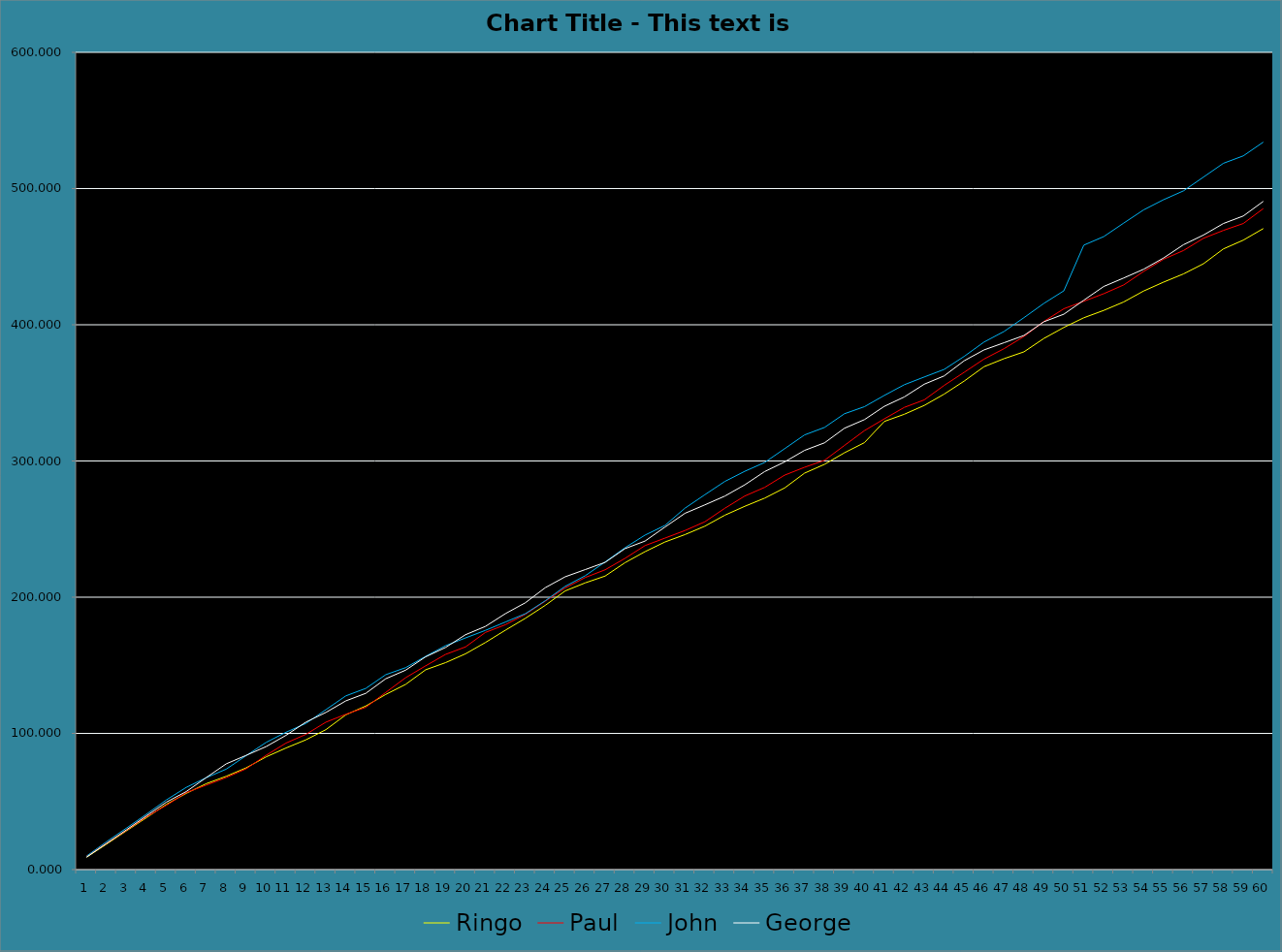
| Category | Ringo | Paul | John | George |
|---|---|---|---|---|
| 0 | 9.112 | 9.902 | 9.903 | 9.095 |
| 1 | 18.694 | 19.224 | 20.458 | 19.196 |
| 2 | 28.428 | 28.824 | 30.459 | 29.201 |
| 3 | 38.083 | 38.768 | 40.66 | 39.439 |
| 4 | 47.923 | 47.185 | 51.139 | 49.519 |
| 5 | 55.989 | 56.522 | 60.38 | 57.294 |
| 6 | 63.088 | 62.011 | 67.46 | 67.557 |
| 7 | 68.505 | 67.576 | 73.738 | 77.635 |
| 8 | 74.698 | 74.008 | 83.643 | 83.864 |
| 9 | 82.735 | 83.901 | 93.362 | 90.295 |
| 10 | 89.275 | 92.894 | 100.828 | 98.567 |
| 11 | 95.293 | 99.287 | 107.333 | 108.324 |
| 12 | 102.755 | 108.248 | 117.426 | 115.391 |
| 13 | 113.643 | 114.039 | 127.548 | 123.867 |
| 14 | 120.112 | 119.129 | 133.038 | 129.423 |
| 15 | 128.586 | 130.064 | 143.095 | 140.122 |
| 16 | 136.013 | 140.907 | 148.27 | 146.431 |
| 17 | 146.689 | 149.581 | 156.548 | 156.221 |
| 18 | 151.942 | 157.991 | 164.397 | 163.099 |
| 19 | 158.428 | 163.498 | 170.074 | 172.448 |
| 20 | 166.747 | 174.135 | 175.649 | 178.566 |
| 21 | 175.77 | 179.776 | 181.76 | 187.917 |
| 22 | 184.488 | 187.482 | 187.883 | 195.918 |
| 23 | 194.018 | 197.068 | 197.412 | 206.989 |
| 24 | 204.626 | 206.845 | 207.984 | 214.981 |
| 25 | 210.495 | 214.414 | 215.717 | 220.241 |
| 26 | 215.513 | 220.119 | 225.864 | 225.575 |
| 27 | 225.353 | 228.536 | 236.343 | 235.655 |
| 28 | 233.419 | 237.873 | 245.584 | 241.205 |
| 29 | 240.518 | 243.362 | 252.664 | 251.468 |
| 30 | 245.935 | 248.927 | 265.324 | 261.546 |
| 31 | 252.128 | 255.359 | 275.229 | 267.775 |
| 32 | 260.165 | 265.252 | 284.948 | 274.206 |
| 33 | 266.705 | 274.245 | 292.414 | 282.478 |
| 34 | 272.723 | 280.638 | 298.919 | 292.235 |
| 35 | 280.185 | 289.599 | 309.012 | 299.302 |
| 36 | 291.073 | 295.39 | 319.134 | 307.778 |
| 37 | 297.542 | 300.48 | 324.624 | 313.334 |
| 38 | 306.016 | 311.415 | 334.681 | 324.033 |
| 39 | 313.443 | 322.258 | 339.856 | 330.342 |
| 40 | 329.041 | 330.932 | 348.134 | 340.132 |
| 41 | 334.294 | 339.342 | 355.983 | 347.01 |
| 42 | 340.78 | 344.849 | 361.66 | 356.359 |
| 43 | 349.099 | 355.486 | 367.235 | 362.477 |
| 44 | 358.629 | 365.072 | 376.764 | 373.548 |
| 45 | 369.237 | 374.849 | 387.336 | 381.54 |
| 46 | 375.106 | 382.418 | 395.069 | 386.8 |
| 47 | 380.124 | 391.418 | 405.216 | 392.134 |
| 48 | 389.964 | 402.418 | 415.695 | 402.214 |
| 49 | 398.03 | 411.755 | 424.936 | 407.764 |
| 50 | 405.129 | 417.244 | 458.454 | 418.027 |
| 51 | 410.546 | 422.809 | 464.732 | 428.105 |
| 52 | 416.739 | 429.241 | 474.637 | 434.334 |
| 53 | 424.776 | 439.134 | 484.356 | 440.765 |
| 54 | 431.316 | 448.127 | 491.822 | 449.037 |
| 55 | 437.334 | 454.52 | 498.327 | 458.794 |
| 56 | 444.796 | 463.481 | 508.42 | 465.861 |
| 57 | 455.684 | 469.272 | 518.542 | 474.337 |
| 58 | 462.153 | 474.362 | 524.032 | 479.893 |
| 59 | 470.627 | 485.297 | 534.089 | 490.592 |